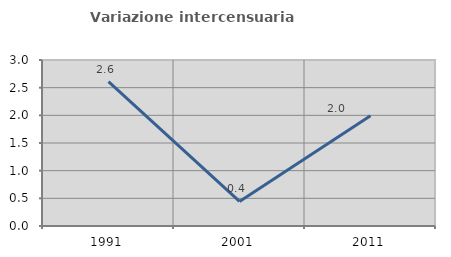
| Category | Variazione intercensuaria annua |
|---|---|
| 1991.0 | 2.61 |
| 2001.0 | 0.444 |
| 2011.0 | 1.993 |